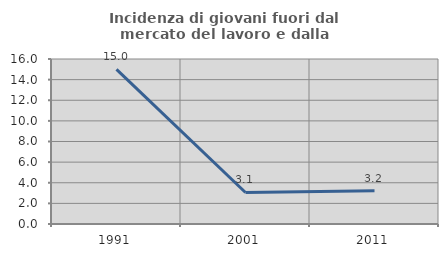
| Category | Incidenza di giovani fuori dal mercato del lavoro e dalla formazione  |
|---|---|
| 1991.0 | 15 |
| 2001.0 | 3.057 |
| 2011.0 | 3.236 |